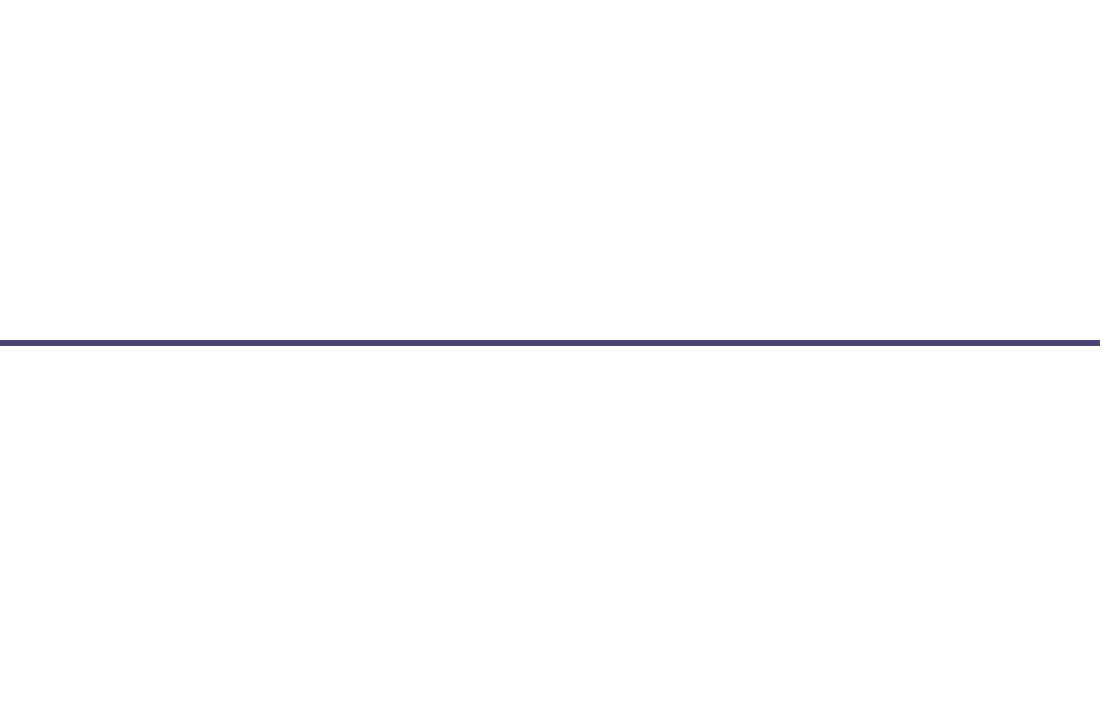
| Category | Positie |
|---|---|
| 0 | 1 |
| 1 | -2 |
| 2 | 1 |
| 3 | -1 |
| 4 | -0.5 |
| 5 | 2 |
| 6 | 0.5 |
| 7 | -1 |
| 8 | 0.5 |
| 9 | -2 |